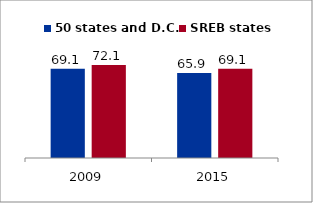
| Category | 50 states and D.C. | SREB states |
|---|---|---|
| 2009.0 | 69.099 | 72.13 |
| 2015.0 | 65.851 | 69.149 |